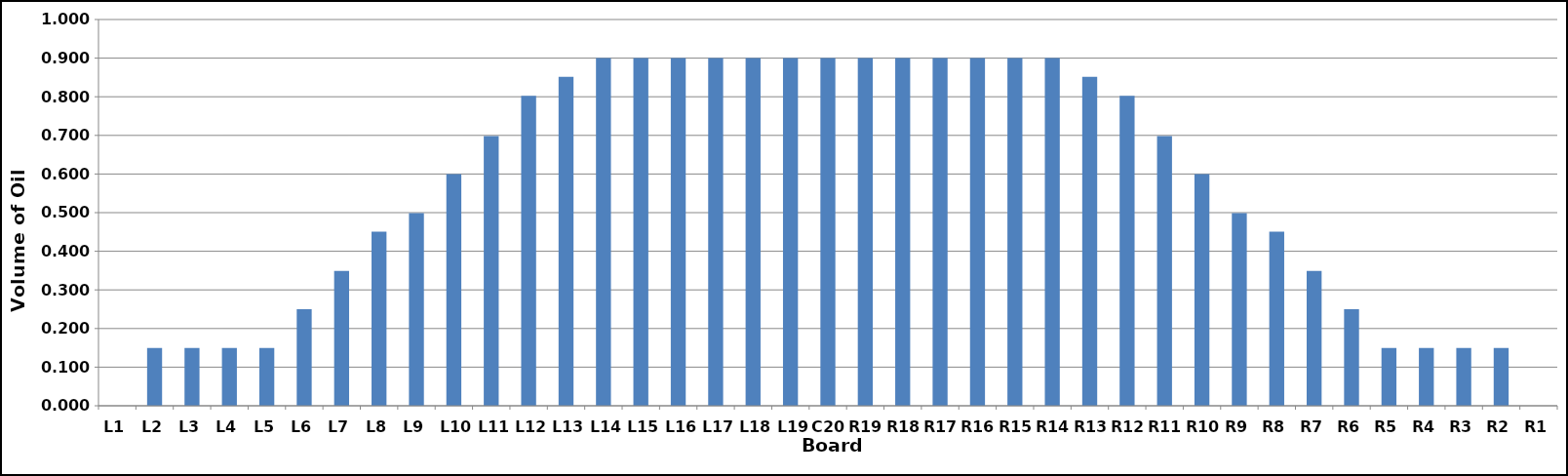
| Category | Series 0 |
|---|---|
| L1 | 0 |
| L2 | 0.15 |
| L3 | 0.15 |
| L4 | 0.15 |
| L5 | 0.15 |
| L6 | 0.25 |
| L7 | 0.349 |
| L8 | 0.451 |
| L9 | 0.499 |
| L10 | 0.6 |
| L11 | 0.698 |
| L12 | 0.802 |
| L13 | 0.852 |
| L14 | 0.9 |
| L15 | 0.9 |
| L16 | 0.9 |
| L17 | 0.9 |
| L18 | 0.9 |
| L19 | 0.9 |
| C20 | 0.9 |
| R19 | 0.9 |
| R18 | 0.9 |
| R17 | 0.9 |
| R16 | 0.9 |
| R15 | 0.9 |
| R14 | 0.9 |
| R13 | 0.852 |
| R12 | 0.802 |
| R11 | 0.698 |
| R10 | 0.6 |
| R9 | 0.499 |
| R8 | 0.451 |
| R7 | 0.349 |
| R6 | 0.25 |
| R5 | 0.15 |
| R4 | 0.15 |
| R3 | 0.15 |
| R2 | 0.15 |
| R1 | 0 |